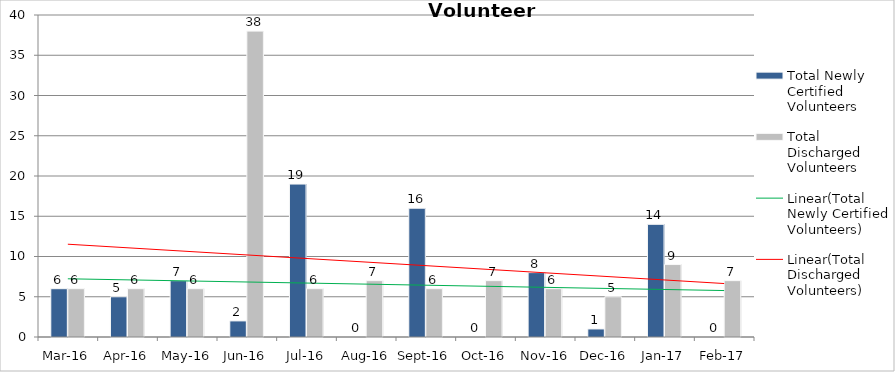
| Category | Total Newly Certified Volunteers | Total Discharged Volunteers |
|---|---|---|
| Mar-16 | 6 | 6 |
| Apr-16 | 5 | 6 |
| May-16 | 7 | 6 |
| Jun-16 | 2 | 38 |
| Jul-16 | 19 | 6 |
| Aug-16 | 0 | 7 |
| Sep-16 | 16 | 6 |
| Oct-16 | 0 | 7 |
| Nov-16 | 8 | 6 |
| Dec-16 | 1 | 5 |
| Jan-17 | 14 | 9 |
| Feb-17 | 0 | 7 |